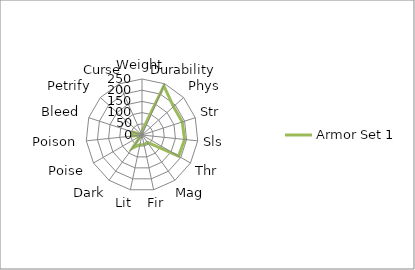
| Category | Armor Set 1 |
|---|---|
| Weight | 17.3 |
| Durability | 240 |
| Phys | 189 |
| Str | 189 |
| Sls | 191 |
| Thr | 189 |
| Mag | 40 |
| Fir | 45 |
| Lit | 44 |
| Dark | 72 |
| Poise | 5 |
| Poison | 42 |
| Bleed | 43 |
| Petrify | 0 |
| Curse | 0 |